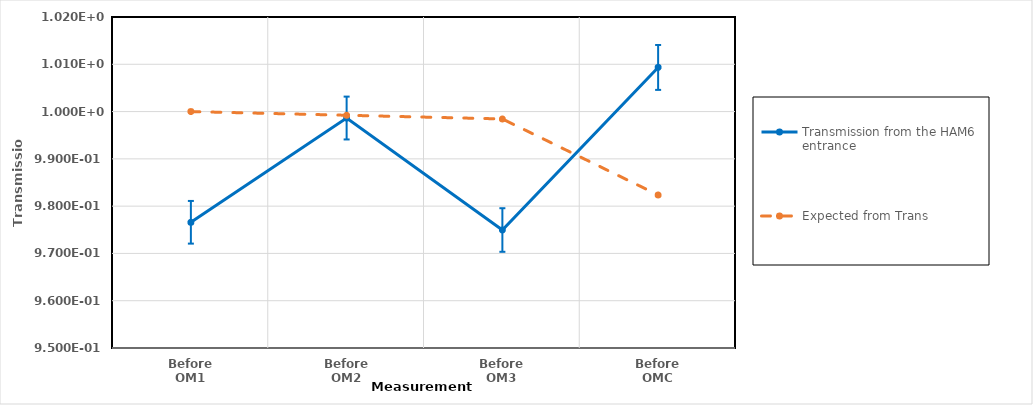
| Category | Transmission from the HAM6 entrance | Expected from Trans |
|---|---|---|
| Before OM1 | 0.977 | 1 |
| Before OM2 | 0.999 | 0.999 |
| Before OM3 | 0.975 | 0.998 |
| Before OMC | 1.009 | 0.982 |